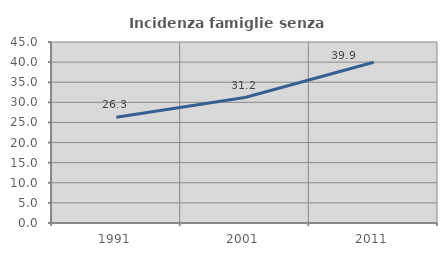
| Category | Incidenza famiglie senza nuclei |
|---|---|
| 1991.0 | 26.316 |
| 2001.0 | 31.198 |
| 2011.0 | 39.95 |